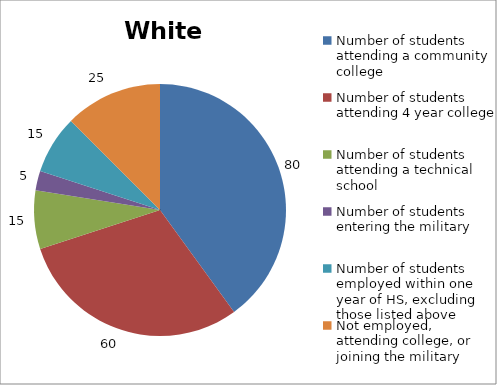
| Category | White |
|---|---|
| Number of students attending a community college | 80 |
| Number of students attending 4 year college | 60 |
| Number of students attending a technical school | 15 |
| Number of students entering the military | 5 |
| Number of students employed within one year of HS, excluding those listed above | 15 |
| Not employed, attending college, or joining the military | 25 |